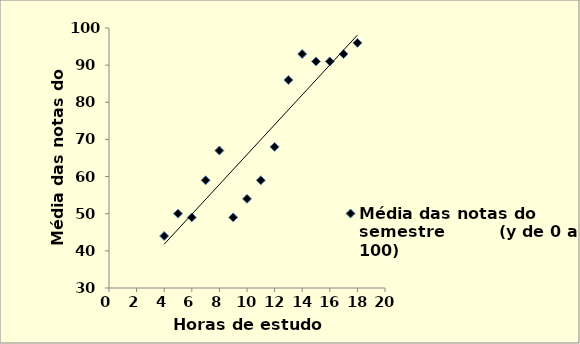
| Category | Média das notas do semestre         (y de 0 a 100) |
|---|---|
| 4.0 | 44 |
| 5.0 | 50 |
| 6.0 | 49 |
| 7.0 | 59 |
| 8.0 | 67 |
| 9.0 | 49 |
| 10.0 | 54 |
| 11.0 | 59 |
| 12.0 | 68 |
| 13.0 | 86 |
| 14.0 | 93 |
| 15.0 | 91 |
| 16.0 | 91 |
| 17.0 | 93 |
| 18.0 | 96 |